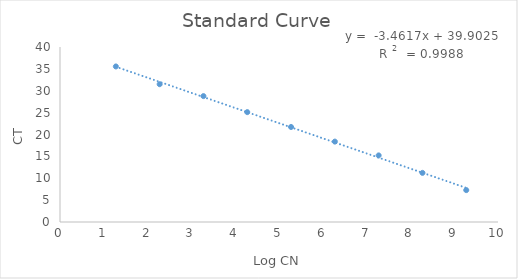
| Category | Standard Curve |
|---|---|
| 9.275167333820246 | 7.289 |
| 8.275167333820246 | 11.229 |
| 7.275167333820245 | 15.223 |
| 6.275167333820245 | 18.377 |
| 5.275167333820245 | 21.719 |
| 4.275167333820245 | 25.112 |
| 3.2751673338202454 | 28.775 |
| 2.2751673338202454 | 31.497 |
| 1.2751673338202454 | 35.553 |